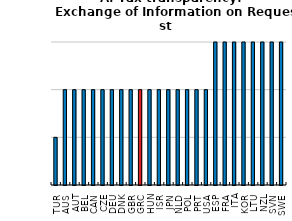
| Category | Overall Rating - converted |
|---|---|
| TUR | 2 |
| AUS | 4 |
| AUT | 4 |
| BEL | 4 |
| CAN | 4 |
| CZE | 4 |
| DEU | 4 |
| DNK | 4 |
| GBR | 4 |
| GRC | 4 |
| HUN | 4 |
| ISR | 4 |
| JPN | 4 |
| NLD | 4 |
| POL | 4 |
| PRT | 4 |
| USA | 4 |
| ESP | 6 |
| FRA | 6 |
| ITA | 6 |
| KOR | 6 |
| LTU | 6 |
| NZL | 6 |
| SVN | 6 |
| SWE | 6 |